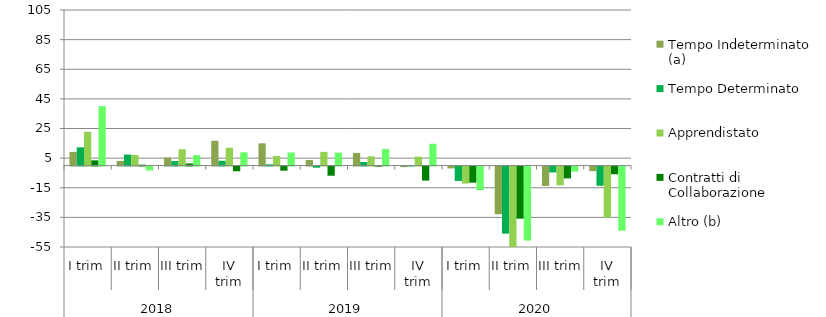
| Category | Tempo Indeterminato (a) | Tempo Determinato | Apprendistato  | Contratti di Collaborazione | Altro (b) |
|---|---|---|---|---|---|
| 0 | 9.2 | 12.3 | 22.8 | 3.5 | 40.1 |
| 1 | 3.1 | 7.4 | 7.1 | 0.6 | -2.7 |
| 2 | 5.4 | 3 | 11 | 1.4 | 7 |
| 3 | 16.7 | 3.2 | 12 | -3.2 | 8.9 |
| 4 | 15 | 0.8 | 6.4 | -2.8 | 8.8 |
| 5 | 3.7 | -0.8 | 9.2 | -6.2 | 8.7 |
| 6 | 8.5 | 2.4 | 6.2 | -0.1 | 11.2 |
| 7 | -0.4 | 0.3 | 6 | -9.5 | 14.7 |
| 8 | -1.3 | -9.7 | -11.5 | -10.9 | -16 |
| 9 | -32.2 | -45.3 | -56.5 | -35.2 | -50 |
| 10 | -13.1 | -4 | -12.7 | -8 | -3.4 |
| 11 | -3.1 | -13 | -34.5 | -5.2 | -43.4 |